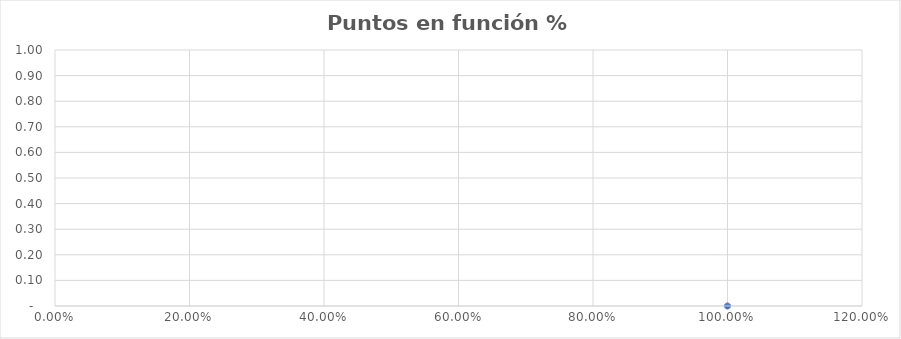
| Category | Series 0 |
|---|---|
| 0 | 0 |
| 1 | 0 |
| 2 | 0 |
| 3 | 0 |
| 4 | 0 |
| 5 | 0 |
| 6 | 0 |
| 7 | 0 |
| 8 | 0 |
| 9 | 0 |
| 10 | 0 |
| 11 | 0 |
| 12 | 0 |
| 13 | 0 |
| 14 | 0 |
| 15 | 0 |
| 16 | 0 |
| 17 | 0 |
| 18 | 0 |
| 19 | 0 |
| 20 | 0 |
| 21 | 0 |
| 22 | 0 |
| 23 | 0 |
| 24 | 0 |
| 25 | 0 |
| 26 | 0 |